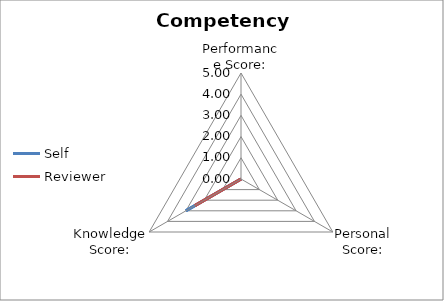
| Category | Self | Reviewer |
|---|---|---|
| Performance Score: | 0 | 0 |
| Personal Score: | 0 | 0 |
| Knowledge Score: | 3 | 2.5 |